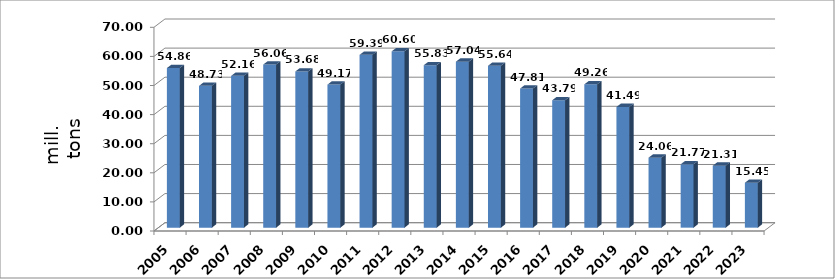
| Category | Series 0 |
|---|---|
| 2005.0 | 54.857 |
| 2006.0 | 48.729 |
| 2007.0 | 52.164 |
| 2008.0 | 56.061 |
| 2009.0 | 53.679 |
| 2010.0 | 49.165 |
| 2011.0 | 59.385 |
| 2012.0 | 60.602 |
| 2013.0 | 55.83 |
| 2014.0 | 57.04 |
| 2015.0 | 55.644 |
| 2016.0 | 47.813 |
| 2017.0 | 43.786 |
| 2018.0 | 49.26 |
| 2019.0 | 41.492 |
| 2020.0 | 24.058 |
| 2021.0 | 21.773 |
| 2022.0 | 21.306 |
| 2023.0 | 15.447 |